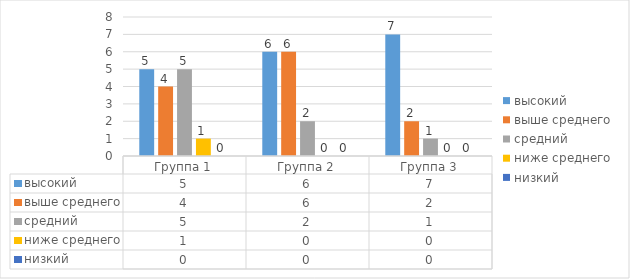
| Category | высокий | выше среднего | средний | ниже среднего | низкий |
|---|---|---|---|---|---|
| Группа 1 | 5 | 4 | 5 | 1 | 0 |
| Группа 2 | 6 | 6 | 2 | 0 | 0 |
| Группа 3 | 7 | 2 | 1 | 0 | 0 |